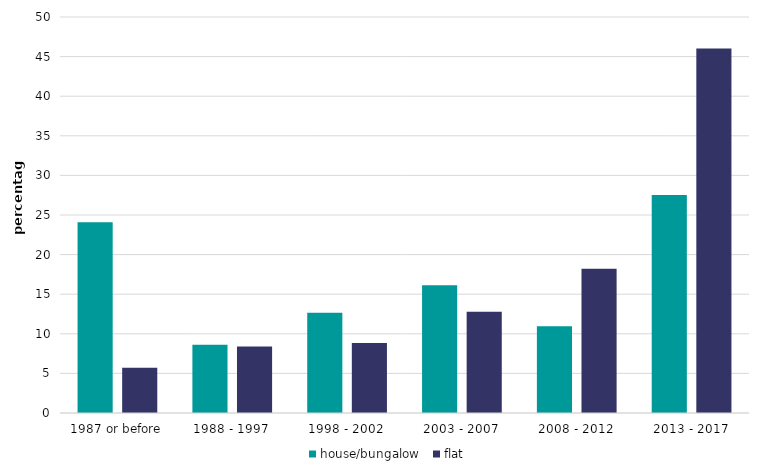
| Category | house/bungalow | flat |
|---|---|---|
| 1987 or before | 24.093 | 5.707 |
| 1988 - 1997 | 8.632 | 8.403 |
| 1998 - 2002 | 12.658 | 8.848 |
| 2003 - 2007 | 16.124 | 12.799 |
| 2008 - 2012 | 10.959 | 18.225 |
| 2013 - 2017 | 27.535 | 46.018 |